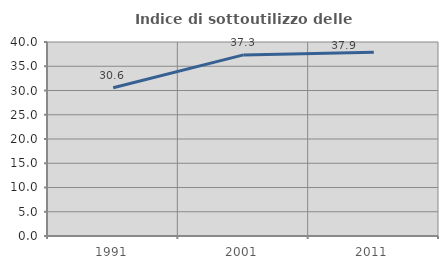
| Category | Indice di sottoutilizzo delle abitazioni  |
|---|---|
| 1991.0 | 30.556 |
| 2001.0 | 37.342 |
| 2011.0 | 37.867 |